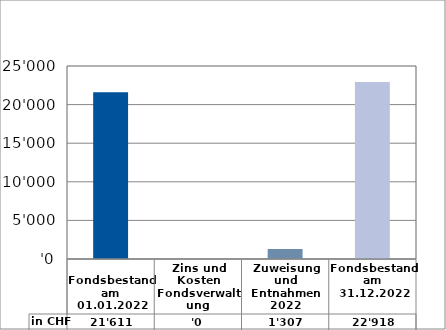
| Category | in CHF |
|---|---|
| 
Fondsbestand am 01.01.2022

 | 21611 |
| Zins und Kosten Fondsverwaltung | 0 |
| Zuweisung und Entnahmen 2022 | 1306.75 |
| Fondsbestand am 31.12.2022 | 22917.75 |